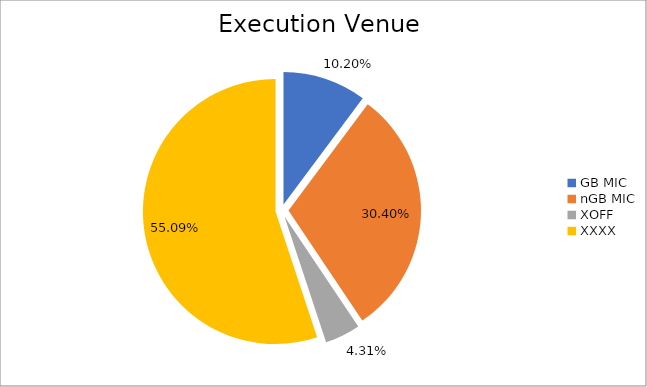
| Category | Series 0 |
|---|---|
| GB MIC | 973569.932 |
| nGB MIC | 2900812.534 |
| XOFF | 411703.128 |
| XXXX | 5257078.285 |